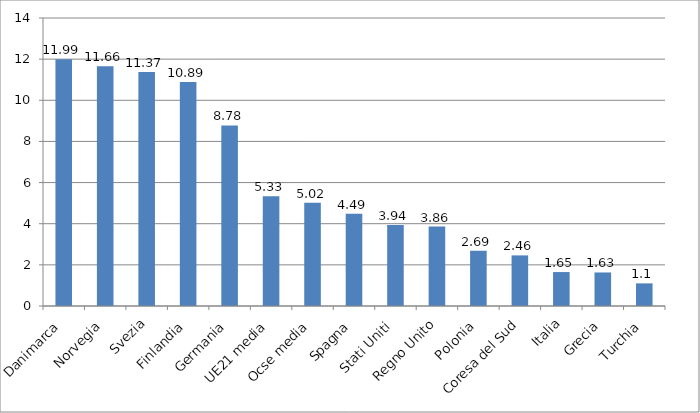
| Category | Series 0 |
|---|---|
| Danimarca | 11.99 |
| Norvegia | 11.66 |
| Svezia | 11.37 |
| Finlandia | 10.89 |
| Germania | 8.78 |
| UE21 media | 5.33 |
| Ocse media | 5.02 |
| Spagna | 4.49 |
| Stati Uniti | 3.94 |
| Regno Unito | 3.86 |
| Polonia | 2.69 |
| Coresa del Sud | 2.46 |
| Italia | 1.65 |
| Grecia | 1.63 |
| Turchia | 1.1 |